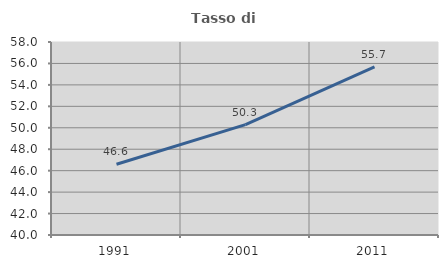
| Category | Tasso di occupazione   |
|---|---|
| 1991.0 | 46.593 |
| 2001.0 | 50.288 |
| 2011.0 | 55.678 |